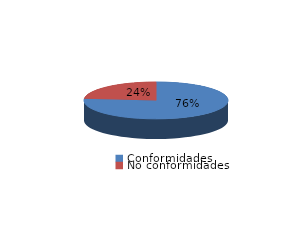
| Category | Series 0 |
|---|---|
| Conformidades | 5626 |
| No conformidades | 1744 |